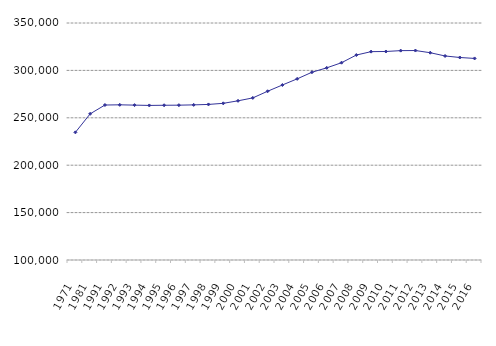
| Category | La Rioja |
|---|---|
| 1971.0 | 234653 |
| 1981.0 | 254201 |
| 1991.0 | 263475 |
| 1992.0 | 263698 |
| 1993.0 | 263382 |
| 1994.0 | 263056 |
| 1995.0 | 263237 |
| 1996.0 | 263331 |
| 1997.0 | 263620 |
| 1998.0 | 264106 |
| 1999.0 | 265274 |
| 2000.0 | 267911 |
| 2001.0 | 270991 |
| 2002.0 | 277993 |
| 2003.0 | 284609 |
| 2004.0 | 291082 |
| 2005.0 | 298050 |
| 2006.0 | 302697 |
| 2007.0 | 308118 |
| 2008.0 | 316192 |
| 2009.0 | 319786 |
| 2010.0 | 319939 |
| 2011.0 | 320850 |
| 2012.0 | 320951 |
| 2013.0 | 318639 |
| 2014.0 | 315223.155 |
| 2015.0 | 313614.899 |
| 2016.0 | 312621.602 |